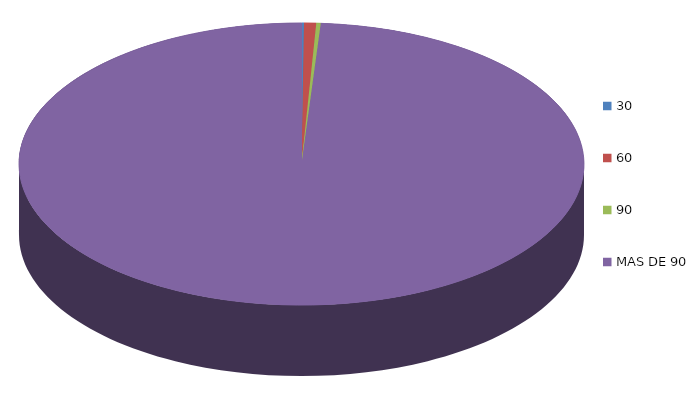
| Category | Series 0 | 63,776.1 |
|---|---|---|
| 0 | 63776.1 |  |
| 1 | 309817.2 |  |
| 2 | 116163.7 |  |
| 3 | 44420899.7 |  |